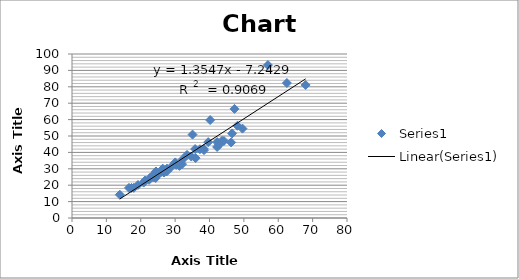
| Category | Series 0 |
|---|---|
| 40.1963645916437 | 59.724 |
| 39.625221209918 | 46.268 |
| 35.8228489673589 | 42.037 |
| 38.3990821779622 | 41.373 |
| 30.3185436535562 | 32.419 |
| 38.285559048055 | 42.239 |
| 46.2964270693489 | 46.086 |
| 26.1160920267634 | 28.113 |
| 31.2655550787353 | 31.772 |
| 26.8872405251923 | 28.543 |
| 19.2089678982101 | 20.145 |
| 28.8504674462672 | 31.155 |
| 22.7955291031399 | 24.347 |
| 13.9075913679349 | 14.201 |
| 24.348463297745 | 24.411 |
| 33.4598246506648 | 38.474 |
| 42.2155217628079 | 43.307 |
| 42.8492848367167 | 44.726 |
| 32.023198102555 | 32.831 |
| 26.407718435117 | 30.074 |
| 34.7015350201685 | 37.492 |
| 23.2313442907291 | 24.775 |
| 67.9691076349647 | 81.123 |
| 30.0538410791305 | 33.901 |
| 48.1229597290648 | 56.234 |
| 20.8348317793335 | 21.579 |
| 17.9830907471366 | 18.383 |
| 23.6889155344537 | 26.354 |
| 16.5683617012442 | 18.355 |
| 21.2610595414947 | 22.856 |
| 26.8173683200133 | 28.812 |
| 37.2316768223166 | 41.918 |
| 17.3112252594507 | 18.303 |
| 22.6933636711593 | 24.434 |
| 25.3522679674366 | 27.065 |
| 35.9635023084746 | 36.509 |
| 24.4269534512209 | 28.37 |
| 23.8748606616944 | 24.767 |
| 32.1967401490514 | 35.752 |
| 49.5965930461746 | 54.488 |
| 27.6512407966155 | 28.551 |
| 35.0693705301863 | 50.862 |
| 27.4356384488043 | 28.525 |
| 43.6429882590616 | 47.028 |
| 62.5112369454586 | 82.301 |
| 56.9949282193456 | 93.243 |
| 26.7819205184801 | 27.708 |
| 44.196846866475 | 46.967 |
| 42.2156267218891 | 46.311 |
| 46.5841018732282 | 51.584 |
| 47.2769471238015 | 66.528 |
| 27.6211718063742 | 30.106 |
| 26.6353496960667 | 28.322 |
| 22.4244428471437 | 23.294 |